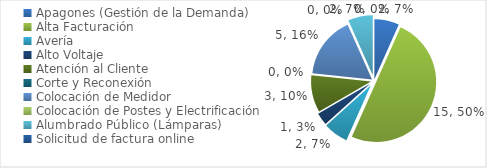
| Category | Series 0 |
|---|---|
| Apagones (Gestión de la Demanda) | 2 |
| Alta Facturación | 15 |
| Avería | 2 |
| Alto Voltaje | 1 |
| Atención al Cliente | 3 |
| Corte y Reconexión  | 0 |
| Colocación de Medidor | 5 |
| Colocación de Postes y Electrificación  | 0 |
| Alumbrado Público (Lámparas) | 2 |
| Solicitud de factura online | 0 |